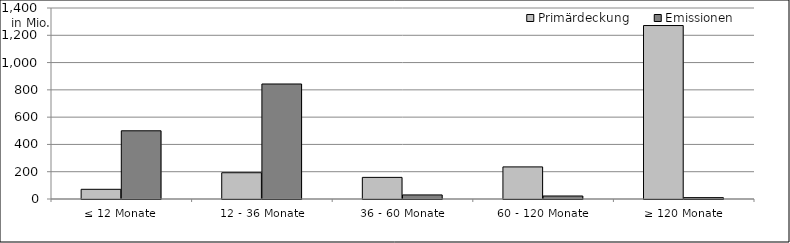
| Category | Primärdeckung | Emissionen |
|---|---|---|
| ≤ 12 Monate | 71097066.983 | 500000000 |
| 12 - 36 Monate | 192543857.459 | 843000000 |
| 36 - 60 Monate | 158471108.96 | 30000000 |
| 60 - 120 Monate | 235295411.477 | 22086000 |
| ≥ 120 Monate | 1271455953.124 | 10000000 |